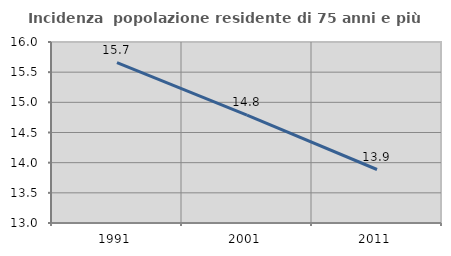
| Category | Incidenza  popolazione residente di 75 anni e più |
|---|---|
| 1991.0 | 15.659 |
| 2001.0 | 14.789 |
| 2011.0 | 13.887 |